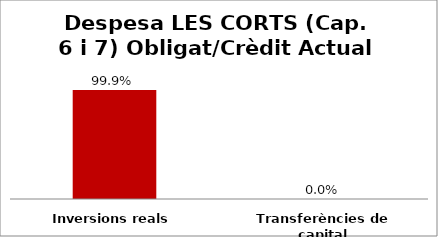
| Category | Series 0 |
|---|---|
| Inversions reals | 0.999 |
| Transferències de capital | 0 |